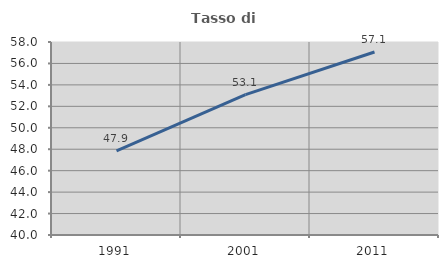
| Category | Tasso di occupazione   |
|---|---|
| 1991.0 | 47.855 |
| 2001.0 | 53.086 |
| 2011.0 | 57.07 |